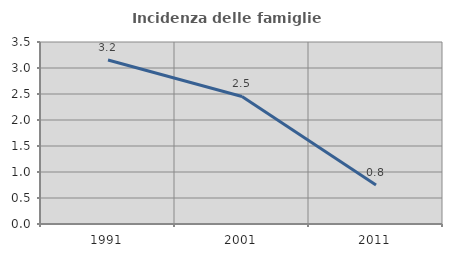
| Category | Incidenza delle famiglie numerose |
|---|---|
| 1991.0 | 3.154 |
| 2001.0 | 2.453 |
| 2011.0 | 0.75 |